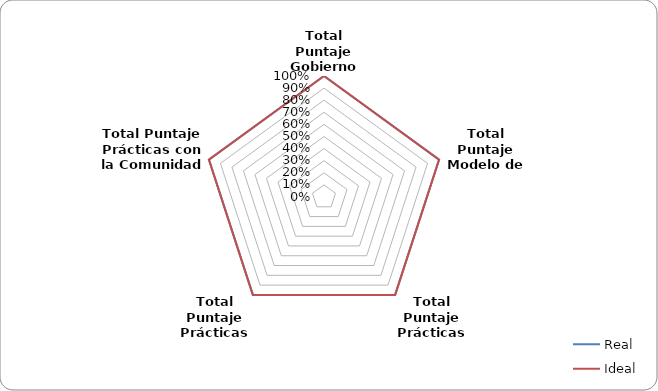
| Category | Real | Ideal |
|---|---|---|
| Total Puntaje Gobierno Corporativo | 1 | 1 |
| Total Puntaje Modelo de Negocio | 1 | 1 |
| Total Puntaje Prácticas Laborales | 1 | 1 |
| Total Puntaje Prácticas Ambientales | 1 | 1 |
| Total Puntaje Prácticas con la Comunidad | 1 | 1 |